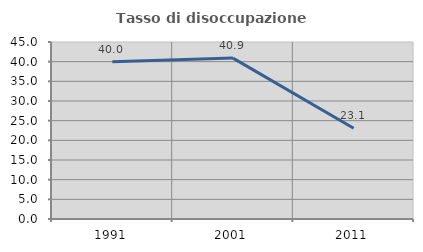
| Category | Tasso di disoccupazione giovanile  |
|---|---|
| 1991.0 | 40 |
| 2001.0 | 40.909 |
| 2011.0 | 23.077 |